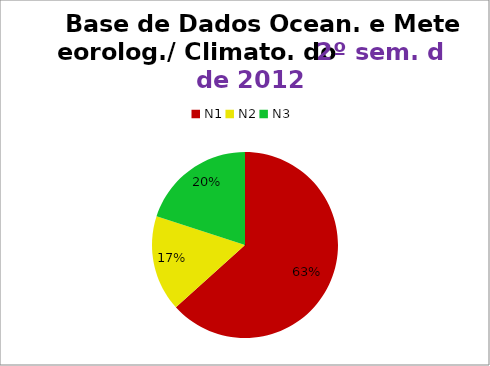
| Category | 2º/12 |
|---|---|
| N1 | 19 |
| N2 | 5 |
| N3 | 6 |